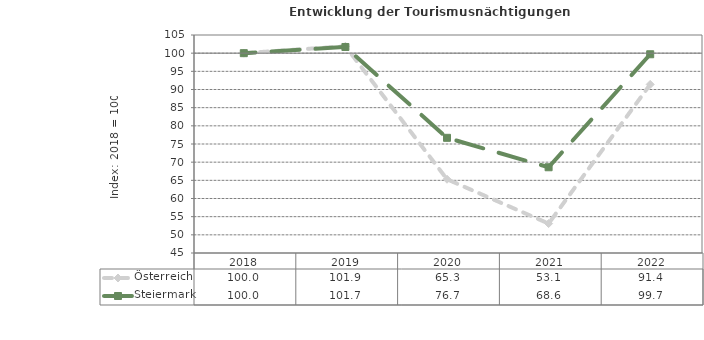
| Category | Österreich | Steiermark |
|---|---|---|
| 2022.0 | 91.4 | 99.7 |
| 2021.0 | 53.1 | 68.6 |
| 2020.0 | 65.3 | 76.7 |
| 2019.0 | 101.9 | 101.7 |
| 2018.0 | 100 | 100 |